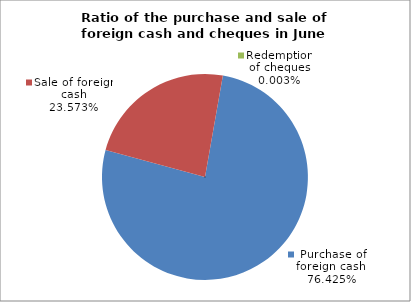
| Category | Purchase of foreign cash |
|---|---|
| 0 | 0.764 |
| 1 | 0.236 |
| 2 | 0 |